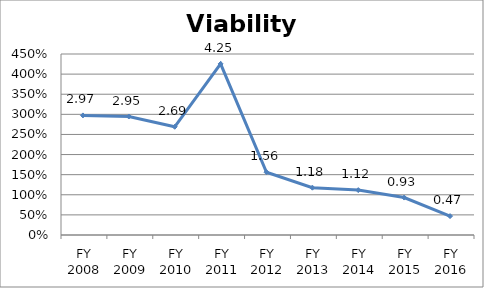
| Category | Viability ratio |
|---|---|
| FY 2016 | 0.47 |
| FY 2015 | 0.931 |
| FY 2014 | 1.116 |
| FY 2013 | 1.177 |
| FY 2012 | 1.561 |
| FY 2011 | 4.254 |
| FY 2010 | 2.691 |
| FY 2009 | 2.946 |
| FY 2008 | 2.973 |